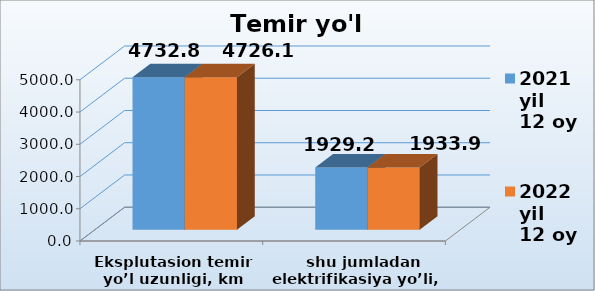
| Category | 2021 yil    
12 oy | 2022 yil    
12 oy |
|---|---|---|
| Eksplutasion temir yo’l uzunligi, km | 4732.8 | 4726.1 |
|    shu jumladan elektrifikasiya yo’li, km | 1929.2 | 1933.9 |